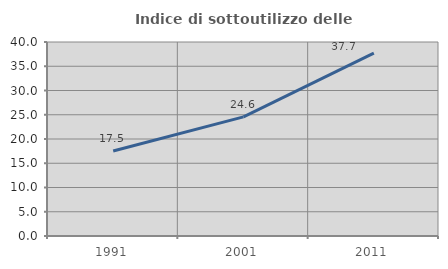
| Category | Indice di sottoutilizzo delle abitazioni  |
|---|---|
| 1991.0 | 17.54 |
| 2001.0 | 24.565 |
| 2011.0 | 37.723 |